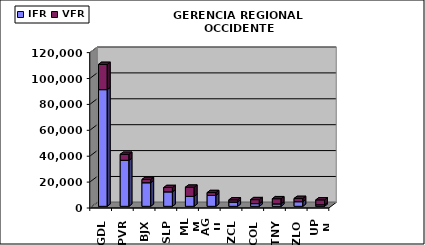
| Category | IFR | VFR |
|---|---|---|
| GDL | 90135 | 19452 |
| PVR | 35561 | 4619 |
| BJX | 18237 | 2511 |
| SLP | 11218 | 3289 |
| MLM | 7677 | 7088 |
| AGU | 8380 | 2248 |
| ZCL | 3333 | 1658 |
| COL | 2083 | 3077 |
| TNY | 1917 | 3957 |
| ZLO | 3603 | 2474 |
| UPN | 1192 | 3777 |